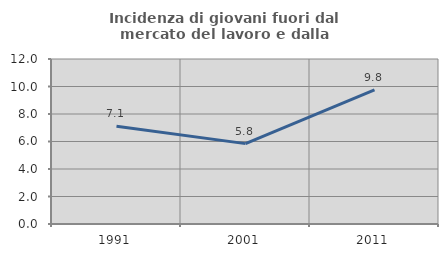
| Category | Incidenza di giovani fuori dal mercato del lavoro e dalla formazione  |
|---|---|
| 1991.0 | 7.108 |
| 2001.0 | 5.846 |
| 2011.0 | 9.756 |